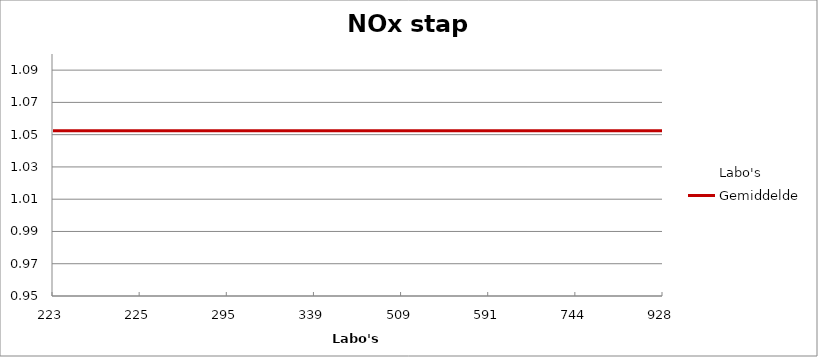
| Category | Labo's | Gemiddelde |
|---|---|---|
| 223.0 | 1.053 | 1.052 |
| 225.0 | 1.035 | 1.052 |
| 295.0 | 0.965 | 1.052 |
| 339.0 | 1.069 | 1.052 |
| 509.0 | 1.06 | 1.052 |
| 591.0 | 1.067 | 1.052 |
| 744.0 | 1.034 | 1.052 |
| 928.0 | 1.095 | 1.052 |